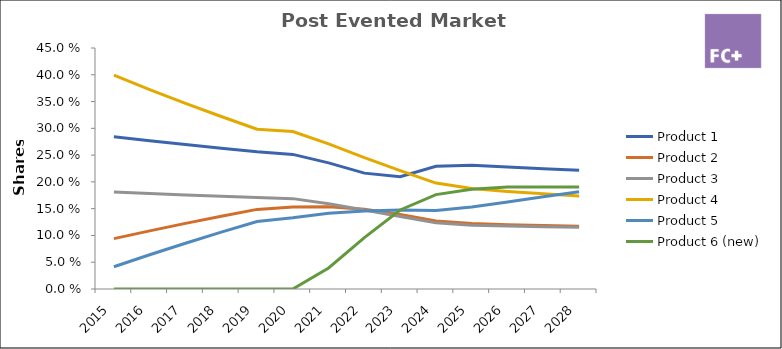
| Category | Product 1 | Product 2 | Product 3 | Product 4 | Product 5 | Product 6 (new) |
|---|---|---|---|---|---|---|
| 2015.0 | 0.284 | 0.094 | 0.181 | 0.399 | 0.041 | 0 |
| 2016.0 | 0.277 | 0.109 | 0.178 | 0.372 | 0.064 | 0 |
| 2017.0 | 0.27 | 0.122 | 0.176 | 0.347 | 0.085 | 0 |
| 2018.0 | 0.263 | 0.136 | 0.173 | 0.322 | 0.106 | 0 |
| 2019.0 | 0.256 | 0.149 | 0.171 | 0.298 | 0.126 | 0 |
| 2020.0 | 0.251 | 0.153 | 0.169 | 0.294 | 0.133 | 0 |
| 2021.0 | 0.235 | 0.153 | 0.159 | 0.271 | 0.141 | 0.039 |
| 2022.0 | 0.216 | 0.149 | 0.148 | 0.245 | 0.146 | 0.096 |
| 2023.0 | 0.21 | 0.139 | 0.135 | 0.221 | 0.147 | 0.148 |
| 2024.0 | 0.229 | 0.127 | 0.124 | 0.198 | 0.146 | 0.176 |
| 2025.0 | 0.231 | 0.122 | 0.119 | 0.188 | 0.153 | 0.186 |
| 2026.0 | 0.228 | 0.12 | 0.117 | 0.182 | 0.162 | 0.19 |
| 2027.0 | 0.225 | 0.119 | 0.116 | 0.178 | 0.172 | 0.191 |
| 2028.0 | 0.222 | 0.117 | 0.115 | 0.174 | 0.182 | 0.191 |